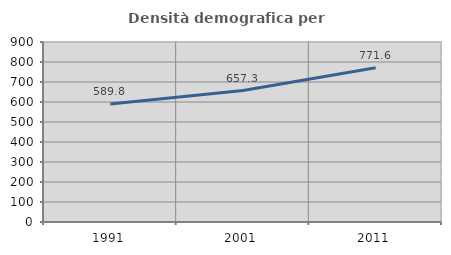
| Category | Densità demografica |
|---|---|
| 1991.0 | 589.821 |
| 2001.0 | 657.321 |
| 2011.0 | 771.55 |